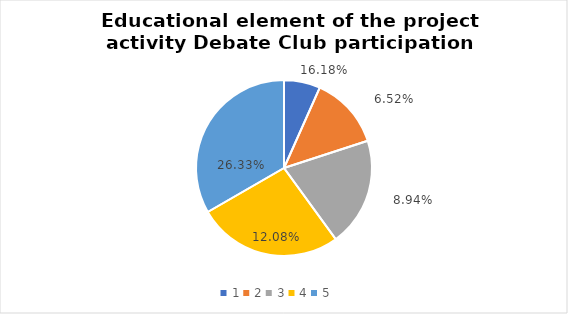
| Category | Series 0 | Series 1 |
|---|---|---|
| 0 | 1 | 0.162 |
| 1 | 2 | 0.065 |
| 2 | 3 | 0.089 |
| 3 | 4 | 0.121 |
| 4 | 5 | 0.263 |